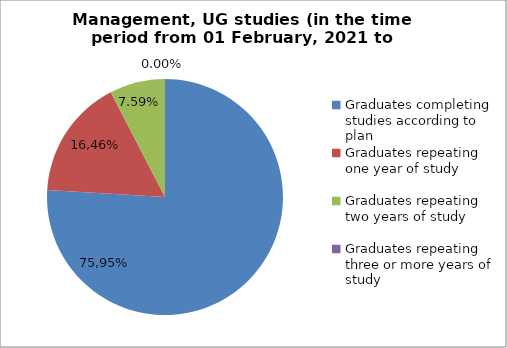
| Category | Series 0 |
|---|---|
| Graduates completing studies according to plan | 75.949 |
| Graduates repeating one year of study | 16.456 |
| Graduates repeating two years of study | 7.595 |
| Graduates repeating three or more years of study | 0 |